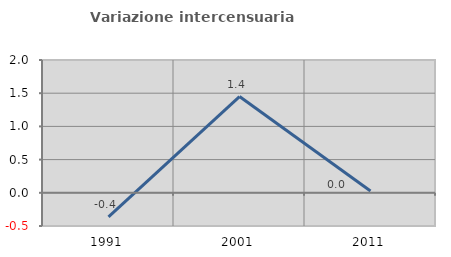
| Category | Variazione intercensuaria annua |
|---|---|
| 1991.0 | -0.364 |
| 2001.0 | 1.45 |
| 2011.0 | 0.027 |